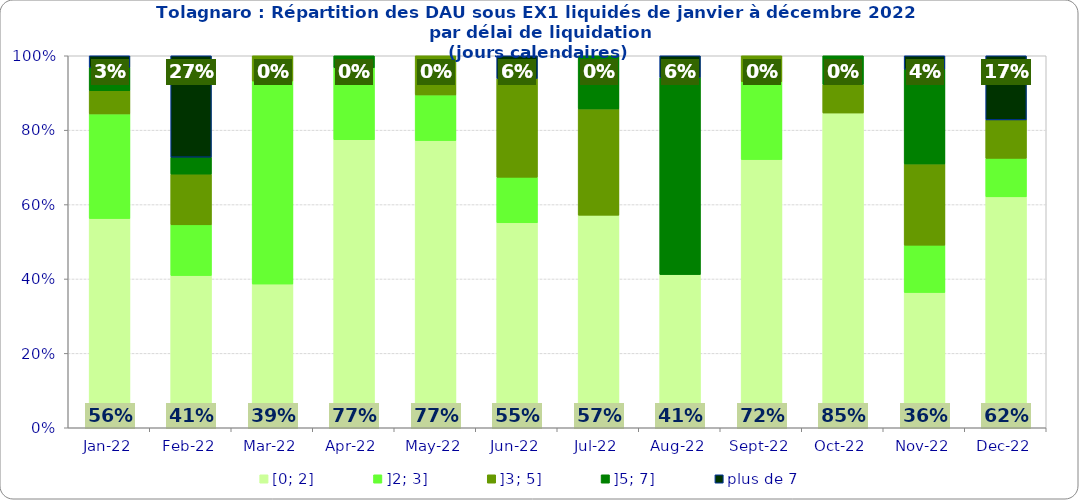
| Category | [0; 2] | ]2; 3] | ]3; 5] | ]5; 7] | plus de 7 |
|---|---|---|---|---|---|
| 2022-01-01 | 0.562 | 0.281 | 0.062 | 0.062 | 0.031 |
| 2022-02-01 | 0.409 | 0.136 | 0.136 | 0.045 | 0.273 |
| 2022-03-01 | 0.386 | 0.545 | 0.068 | 0 | 0 |
| 2022-04-01 | 0.774 | 0.194 | 0 | 0.032 | 0 |
| 2022-05-01 | 0.772 | 0.123 | 0.105 | 0 | 0 |
| 2022-06-01 | 0.551 | 0.122 | 0.265 | 0 | 0.061 |
| 2022-07-01 | 0.571 | 0 | 0.286 | 0.143 | 0 |
| 2022-08-01 | 0.412 | 0 | 0 | 0.529 | 0.059 |
| 2022-09-01 | 0.721 | 0.209 | 0.07 | 0 | 0 |
| 2022-10-01 | 0.846 | 0 | 0.077 | 0.077 | 0 |
| 2022-11-01 | 0.364 | 0.127 | 0.218 | 0.255 | 0.036 |
| 2022-12-01 | 0.621 | 0.103 | 0.103 | 0 | 0.172 |